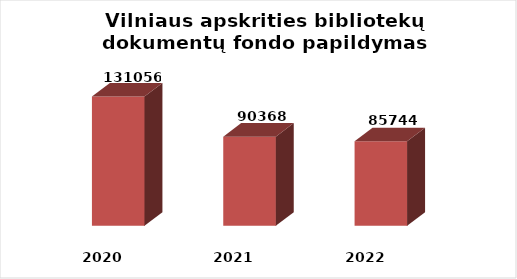
| Category | Series 0 |
|---|---|
| 2020.0 | 131056 |
| 2021.0 | 90368 |
| 2022.0 | 85744 |